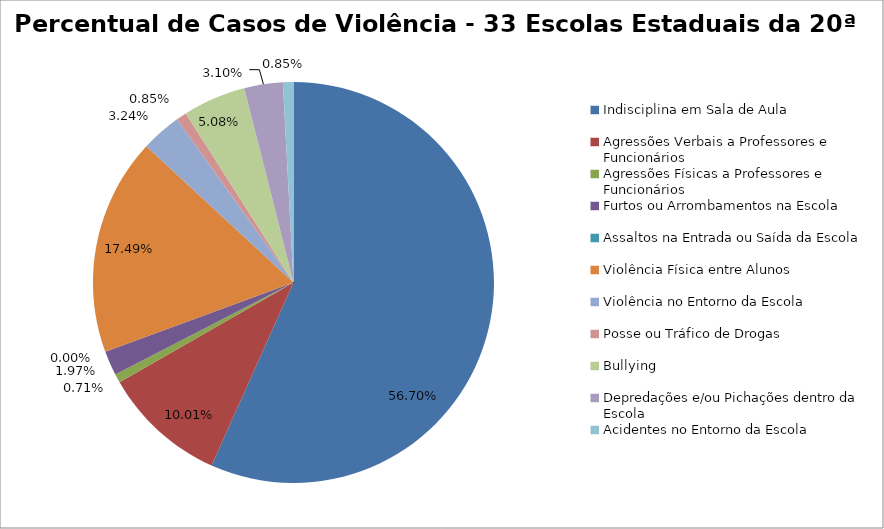
| Category | Percentual |
|---|---|
| Indisciplina em Sala de Aula | 0.567 |
| Agressões Verbais a Professores e Funcionários | 0.1 |
| Agressões Físicas a Professores e Funcionários | 0.007 |
| Furtos ou Arrombamentos na Escola | 0.02 |
| Assaltos na Entrada ou Saída da Escola | 0 |
| Violência Física entre Alunos | 0.175 |
| Violência no Entorno da Escola | 0.032 |
| Posse ou Tráfico de Drogas | 0.008 |
| Bullying | 0.051 |
| Depredações e/ou Pichações dentro da Escola | 0.031 |
| Acidentes no Entorno da Escola | 0.008 |